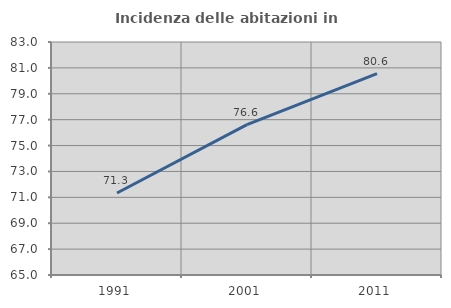
| Category | Incidenza delle abitazioni in proprietà  |
|---|---|
| 1991.0 | 71.335 |
| 2001.0 | 76.614 |
| 2011.0 | 80.55 |